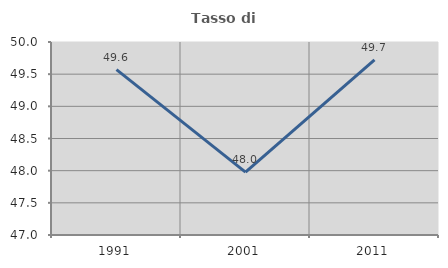
| Category | Tasso di occupazione   |
|---|---|
| 1991.0 | 49.57 |
| 2001.0 | 47.978 |
| 2011.0 | 49.723 |